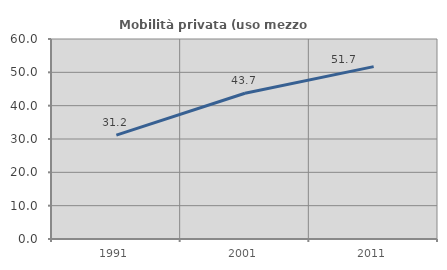
| Category | Mobilità privata (uso mezzo privato) |
|---|---|
| 1991.0 | 31.161 |
| 2001.0 | 43.72 |
| 2011.0 | 51.706 |